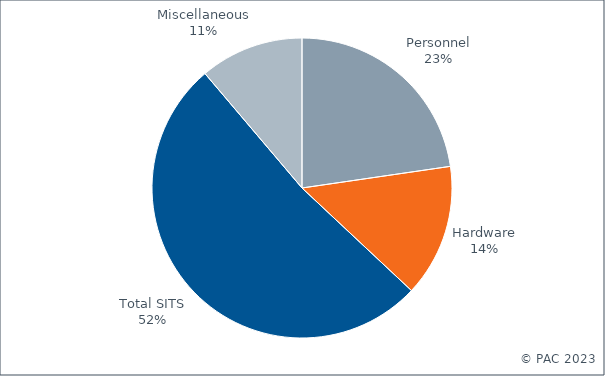
| Category | Series 0 |
|---|---|
| Personnel | 0.227 |
| Hardware | 0.143 |
| Total SITS | 0.518 |
| Miscellaneous | 0.112 |